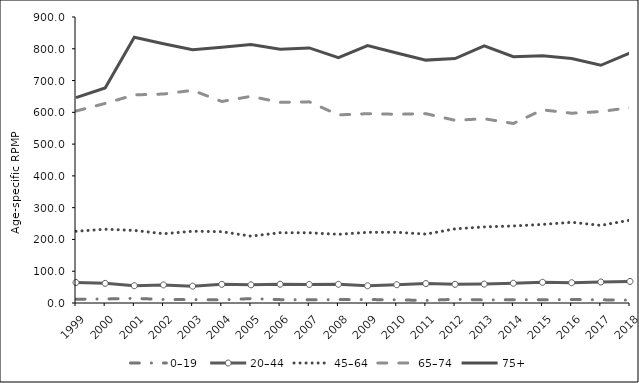
| Category | 0–19  | 20–44 | 45–64 | 65–74 | 75+ |
|---|---|---|---|---|---|
| 1999.0 | 11.8 | 64.5 | 225.7 | 604 | 646.4 |
| 2000.0 | 12.6 | 61.8 | 232.1 | 628.1 | 676.7 |
| 2001.0 | 14.7 | 54.4 | 228.4 | 654.9 | 836.2 |
| 2002.0 | 11.1 | 56.9 | 218.1 | 657.6 | 816.1 |
| 2003.0 | 10.5 | 53 | 225.8 | 669.2 | 796.7 |
| 2004.0 | 9.7 | 58.8 | 224.4 | 634.1 | 804.8 |
| 2005.0 | 13.8 | 57.1 | 210.3 | 650.3 | 813.7 |
| 2006.0 | 10.6 | 59.1 | 221.2 | 631.4 | 798.2 |
| 2007.0 | 10.1 | 58.4 | 221 | 633 | 802.7 |
| 2008.0 | 10.8 | 58.9 | 216.1 | 592 | 772.1 |
| 2009.0 | 10.9 | 54.2 | 222.4 | 595.7 | 810 |
| 2010.0 | 9.9 | 57.5 | 222.6 | 593.9 | 786.9 |
| 2011.0 | 8.1 | 61.2 | 216.8 | 595.8 | 764.3 |
| 2012.0 | 11.7 | 58.8 | 233.2 | 575 | 769.4 |
| 2013.0 | 9.6 | 59.5 | 239.5 | 579.8 | 809.3 |
| 2014.0 | 10.4 | 62.2 | 242.5 | 564.9 | 775.2 |
| 2015.0 | 10 | 65.2 | 247.2 | 607.8 | 778.1 |
| 2016.0 | 10.9 | 63.8 | 254 | 597.2 | 769.6 |
| 2017.0 | 10 | 66.1 | 244.2 | 602.4 | 748.1 |
| 2018.0 | 9 | 67.9 | 260.8 | 615 | 787.1 |